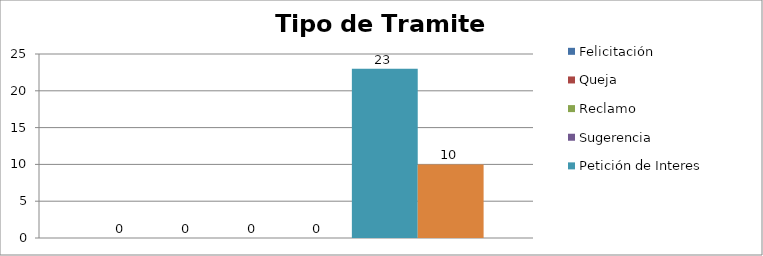
| Category | Felicitación | Queja | Reclamo | Sugerencia | Petición de Interes General | Petición de Interes Particular |
|---|---|---|---|---|---|---|
| 0 | 0 | 0 | 0 | 0 | 23 | 10 |